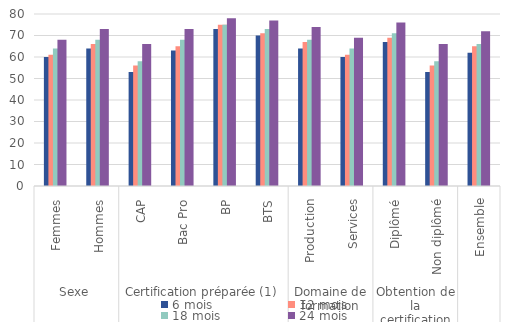
| Category | 6 mois | 12 mois | 18 mois | 24 mois |
|---|---|---|---|---|
| 0 | 60 | 61 | 64 | 68 |
| 1 | 64 | 66 | 68 | 73 |
| 2 | 53 | 56 | 58 | 66 |
| 3 | 63 | 65 | 68 | 73 |
| 4 | 73 | 75 | 75 | 78 |
| 5 | 70 | 71 | 73 | 77 |
| 6 | 64 | 67 | 68 | 74 |
| 7 | 60 | 61 | 64 | 69 |
| 8 | 67 | 69 | 71 | 76 |
| 9 | 53 | 56 | 58 | 66 |
| 10 | 62 | 65 | 66 | 72 |